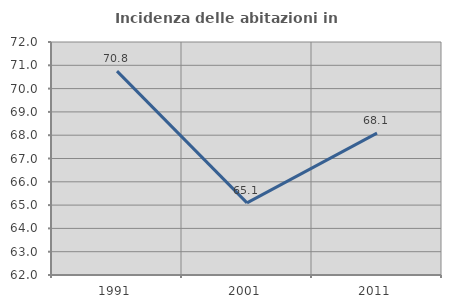
| Category | Incidenza delle abitazioni in proprietà  |
|---|---|
| 1991.0 | 70.751 |
| 2001.0 | 65.098 |
| 2011.0 | 68.092 |